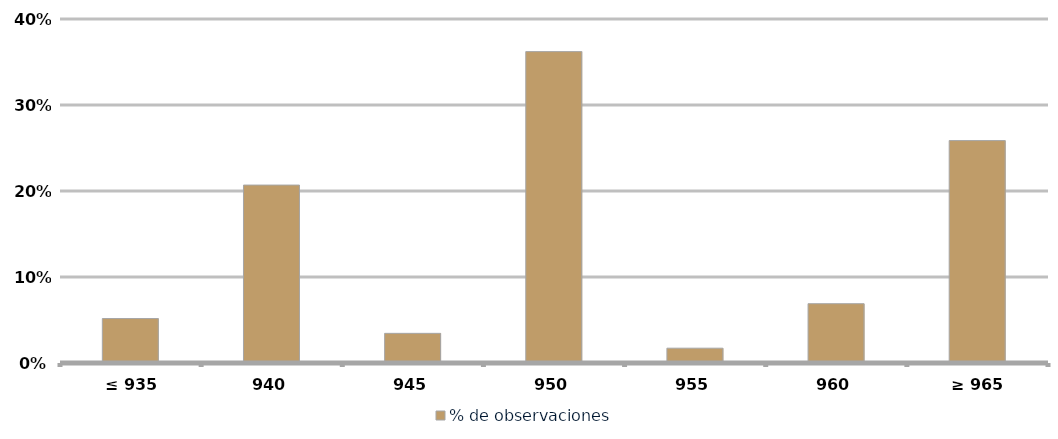
| Category | % de observaciones  |
|---|---|
|  ≤ 935  | 0.052 |
|  940  | 0.207 |
|  945  | 0.034 |
|  950  | 0.362 |
|  955  | 0.017 |
| 960 | 0.069 |
|  ≥ 965  | 0.259 |